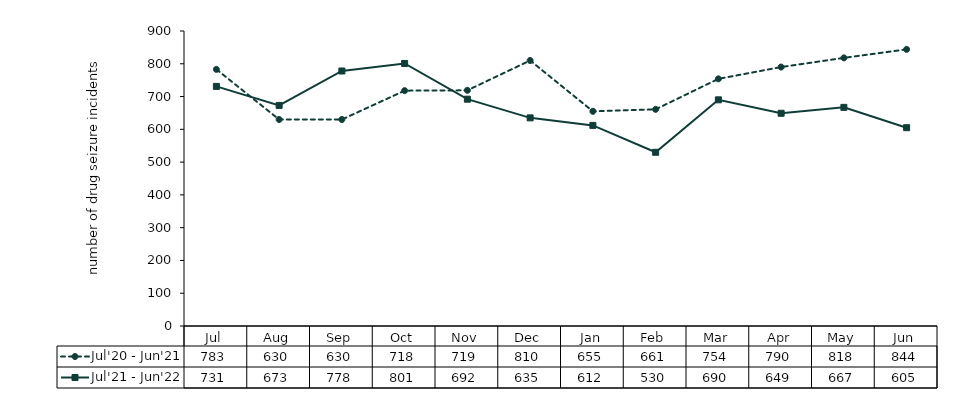
| Category | Jul'20 - Jun'21 | Jul'21 - Jun'22 |
|---|---|---|
| Jul | 783 | 731 |
| Aug | 630 | 673 |
| Sep | 630 | 778 |
| Oct | 718 | 801 |
| Nov | 719 | 692 |
| Dec | 810 | 635 |
| Jan | 655 | 612 |
| Feb | 661 | 530 |
| Mar | 754 | 690 |
| Apr | 790 | 649 |
| May | 818 | 667 |
| Jun | 844 | 605 |